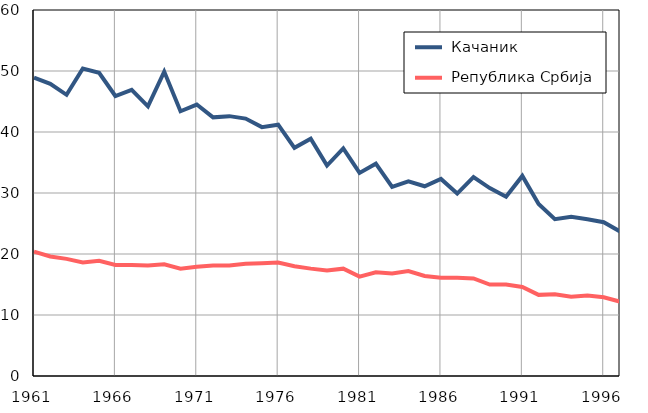
| Category |  Качаник |  Република Србија |
|---|---|---|
| 1961.0 | 48.9 | 20.4 |
| 1962.0 | 47.9 | 19.6 |
| 1963.0 | 46.1 | 19.2 |
| 1964.0 | 50.4 | 18.6 |
| 1965.0 | 49.7 | 18.9 |
| 1966.0 | 45.9 | 18.2 |
| 1967.0 | 46.9 | 18.2 |
| 1968.0 | 44.2 | 18.1 |
| 1969.0 | 49.9 | 18.3 |
| 1970.0 | 43.4 | 17.6 |
| 1971.0 | 44.5 | 17.9 |
| 1972.0 | 42.4 | 18.1 |
| 1973.0 | 42.6 | 18.1 |
| 1974.0 | 42.2 | 18.4 |
| 1975.0 | 40.8 | 18.5 |
| 1976.0 | 41.2 | 18.6 |
| 1977.0 | 37.4 | 18 |
| 1978.0 | 38.9 | 17.6 |
| 1979.0 | 34.5 | 17.3 |
| 1980.0 | 37.3 | 17.6 |
| 1981.0 | 33.3 | 16.3 |
| 1982.0 | 34.8 | 17 |
| 1983.0 | 31 | 16.8 |
| 1984.0 | 31.9 | 17.2 |
| 1985.0 | 31.1 | 16.4 |
| 1986.0 | 32.3 | 16.1 |
| 1987.0 | 29.9 | 16.1 |
| 1988.0 | 32.6 | 16 |
| 1989.0 | 30.8 | 15 |
| 1990.0 | 29.4 | 15 |
| 1991.0 | 32.8 | 14.6 |
| 1992.0 | 28.2 | 13.3 |
| 1993.0 | 25.7 | 13.4 |
| 1994.0 | 26.1 | 13 |
| 1995.0 | 25.7 | 13.2 |
| 1996.0 | 25.2 | 12.9 |
| 1997.0 | 23.7 | 12.2 |